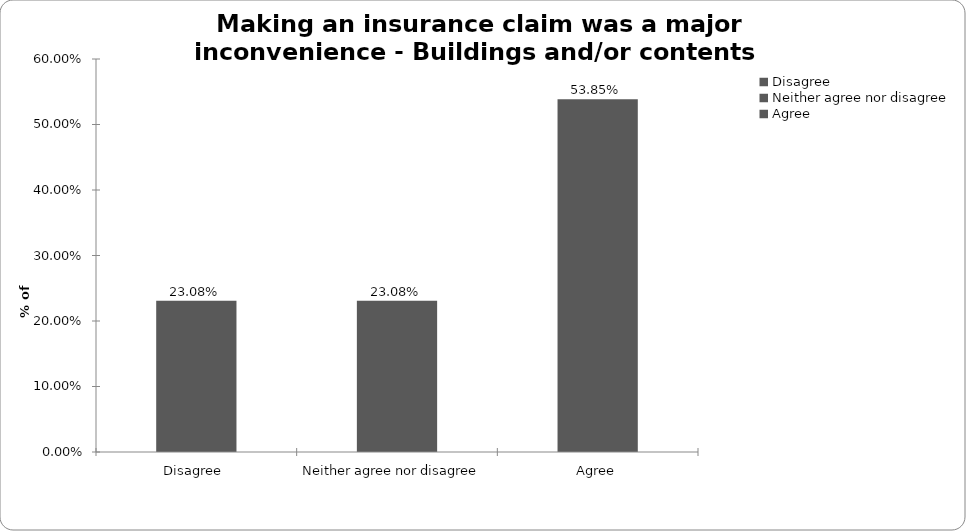
| Category | Buildings and/or conents |
|---|---|
| Disagree  | 0.231 |
| Neither agree nor disagree  | 0.231 |
| Agree | 0.538 |